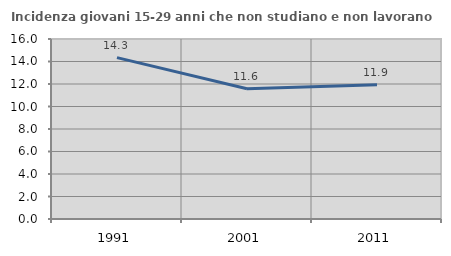
| Category | Incidenza giovani 15-29 anni che non studiano e non lavorano  |
|---|---|
| 1991.0 | 14.341 |
| 2001.0 | 11.581 |
| 2011.0 | 11.933 |